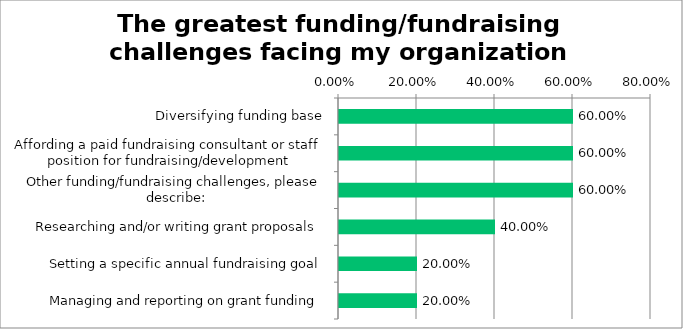
| Category | Responses |
|---|---|
| Diversifying funding base | 0.6 |
| Affording a paid fundraising consultant or staff position for fundraising/development | 0.6 |
| Other funding/fundraising challenges, please describe: | 0.6 |
| Researching and/or writing grant proposals | 0.4 |
| Setting a specific annual fundraising goal | 0.2 |
| Managing and reporting on grant funding | 0.2 |